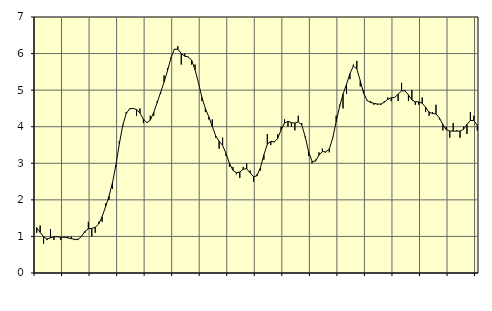
| Category | Piggar | Series 1 |
|---|---|---|
| nan | 1.1 | 1.24 |
| 87.0 | 1.3 | 1.11 |
| 87.0 | 0.8 | 0.99 |
| 87.0 | 0.9 | 0.93 |
| nan | 1.2 | 0.96 |
| 88.0 | 0.9 | 0.99 |
| 88.0 | 1 | 0.99 |
| 88.0 | 0.9 | 0.98 |
| nan | 1 | 0.98 |
| 89.0 | 1 | 0.96 |
| 89.0 | 1 | 0.94 |
| 89.0 | 0.9 | 0.92 |
| nan | 0.9 | 0.92 |
| 90.0 | 1 | 1 |
| 90.0 | 1.1 | 1.14 |
| 90.0 | 1.4 | 1.21 |
| nan | 1 | 1.22 |
| 91.0 | 1.1 | 1.25 |
| 91.0 | 1.4 | 1.34 |
| 91.0 | 1.4 | 1.54 |
| nan | 1.9 | 1.81 |
| 92.0 | 2 | 2.1 |
| 92.0 | 2.3 | 2.46 |
| 92.0 | 2.9 | 2.95 |
| nan | 3.6 | 3.53 |
| 93.0 | 4 | 4.04 |
| 93.0 | 4.4 | 4.36 |
| 93.0 | 4.5 | 4.49 |
| nan | 4.5 | 4.5 |
| 94.0 | 4.3 | 4.47 |
| 94.0 | 4.5 | 4.37 |
| 94.0 | 4.1 | 4.21 |
| nan | 4.1 | 4.11 |
| 95.0 | 4.3 | 4.18 |
| 95.0 | 4.3 | 4.39 |
| 95.0 | 4.7 | 4.66 |
| nan | 4.9 | 4.94 |
| 96.0 | 5.4 | 5.22 |
| 96.0 | 5.6 | 5.53 |
| 96.0 | 5.9 | 5.88 |
| nan | 6.1 | 6.12 |
| 97.0 | 6.2 | 6.12 |
| 97.0 | 5.7 | 6 |
| 97.0 | 6 | 5.93 |
| nan | 5.9 | 5.91 |
| 98.0 | 5.7 | 5.82 |
| 98.0 | 5.7 | 5.56 |
| 98.0 | 5.2 | 5.2 |
| nan | 4.7 | 4.8 |
| 99.0 | 4.4 | 4.5 |
| 99.0 | 4.2 | 4.27 |
| 99.0 | 4.2 | 4.01 |
| nan | 3.7 | 3.75 |
| 0.0 | 3.4 | 3.6 |
| 0.0 | 3.7 | 3.49 |
| 0.0 | 3.2 | 3.27 |
| nan | 2.9 | 3 |
| 1.0 | 2.9 | 2.81 |
| 1.0 | 2.7 | 2.74 |
| 1.0 | 2.6 | 2.76 |
| nan | 2.9 | 2.84 |
| 2.0 | 3 | 2.85 |
| 2.0 | 2.8 | 2.74 |
| 2.0 | 2.5 | 2.63 |
| nan | 2.7 | 2.66 |
| 3.0 | 2.8 | 2.88 |
| 3.0 | 3.1 | 3.23 |
| 3.0 | 3.8 | 3.52 |
| nan | 3.5 | 3.6 |
| 4.0 | 3.6 | 3.58 |
| 4.0 | 3.8 | 3.68 |
| 4.0 | 4 | 3.91 |
| nan | 4.2 | 4.1 |
| 5.0 | 4 | 4.15 |
| 5.0 | 4 | 4.11 |
| 5.0 | 3.9 | 4.1 |
| nan | 4.3 | 4.13 |
| 6.0 | 4.1 | 4.05 |
| 6.0 | 3.7 | 3.73 |
| 6.0 | 3.2 | 3.31 |
| nan | 3 | 3.05 |
| 7.0 | 3.1 | 3.06 |
| 7.0 | 3.3 | 3.22 |
| 7.0 | 3.4 | 3.32 |
| nan | 3.3 | 3.31 |
| 8.0 | 3.3 | 3.39 |
| 8.0 | 3.7 | 3.69 |
| 8.0 | 4.3 | 4.14 |
| nan | 4.6 | 4.55 |
| 9.0 | 4.5 | 4.89 |
| 9.0 | 4.9 | 5.16 |
| 9.0 | 5.3 | 5.45 |
| nan | 5.7 | 5.66 |
| 10.0 | 5.8 | 5.58 |
| 10.0 | 5.1 | 5.26 |
| 10.0 | 5 | 4.91 |
| nan | 4.7 | 4.72 |
| 11.0 | 4.7 | 4.66 |
| 11.0 | 4.6 | 4.64 |
| 11.0 | 4.6 | 4.62 |
| nan | 4.6 | 4.62 |
| 12.0 | 4.7 | 4.67 |
| 12.0 | 4.8 | 4.75 |
| 12.0 | 4.7 | 4.79 |
| nan | 4.8 | 4.8 |
| 13.0 | 4.7 | 4.89 |
| 13.0 | 5.2 | 4.98 |
| 13.0 | 5 | 4.98 |
| nan | 4.7 | 4.87 |
| 14.0 | 5 | 4.73 |
| 14.0 | 4.6 | 4.68 |
| 14.0 | 4.6 | 4.68 |
| nan | 4.8 | 4.64 |
| 15.0 | 4.4 | 4.53 |
| 15.0 | 4.3 | 4.4 |
| 15.0 | 4.4 | 4.36 |
| nan | 4.6 | 4.35 |
| 16.0 | 4.2 | 4.24 |
| 16.0 | 3.9 | 4.06 |
| 16.0 | 4 | 3.92 |
| nan | 3.7 | 3.88 |
| 17.0 | 4.1 | 3.88 |
| 17.0 | 3.9 | 3.88 |
| 17.0 | 3.7 | 3.88 |
| nan | 4 | 3.93 |
| 18.0 | 3.8 | 4.06 |
| 18.0 | 4.4 | 4.17 |
| 18.0 | 4.3 | 4.17 |
| nan | 3.9 | 4.04 |